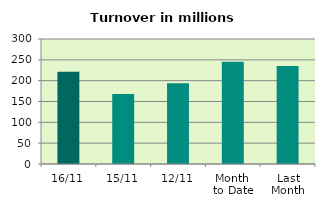
| Category | Series 0 |
|---|---|
| 16/11 | 221.299 |
| 15/11 | 168.054 |
| 12/11 | 194.04 |
| Month 
to Date | 245.414 |
| Last
Month | 235.36 |